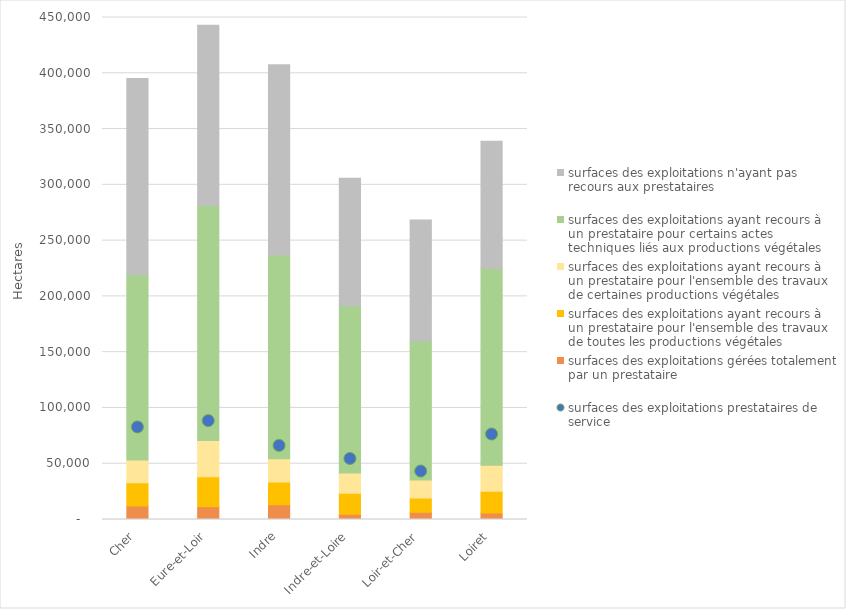
| Category | surfaces des exploitations gérées totalement par un prestataire | surfaces des exploitations ayant recours à un prestataire pour l'ensemble des travaux de toutes les productions végétales | surfaces des exploitations ayant recours à un prestataire pour l'ensemble des travaux de certaines productions végétales | surfaces des exploitations ayant recours à un prestataire pour certains actes techniques liés aux productions végétales | surfaces des exploitations n'ayant pas recours aux prestataires |
|---|---|---|---|---|---|
| Cher | 12087.27 | 20840.29 | 20471.51 | 166297.19 | 175701.74 |
| Eure-et-Loir | 11529.33 | 26774.98 | 32515.67 | 210609.1 | 161530.92 |
| Indre | 13261.46 | 20316.96 | 20875.56 | 182565.53 | 170558.49 |
| Indre-et-Loire | 4657.52 | 18863.2 | 18130.44 | 149972.15 | 114234.69 |
| Loir-et-Cher | 6452.1 | 12834.44 | 16045.5 | 124742.68 | 108300.28 |
| Loiret | 5860.22 | 19418.61 | 23375.03 | 176265.42 | 114190.72 |